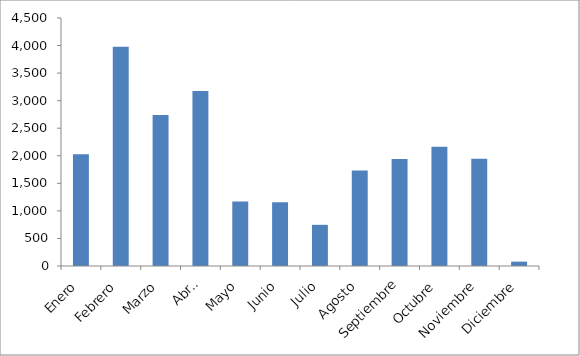
| Category | Series 0 |
|---|---|
| Enero | 2027 |
| Febrero | 3980 |
| Marzo | 2742 |
| Abril | 3175 |
| Mayo | 1170 |
| Junio | 1155 |
| Julio | 747 |
| Agosto | 1731 |
| Septiembre | 1942 |
| Octubre | 2162 |
| Noviembre | 1947 |
| Diciembre | 79 |